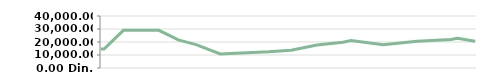
| Category | KVARTAL4 |
|---|---|
| 2013-04-23 | 14600 |
| 2013-04-25 | 14600 |
| 2013-05-07 | 29000 |
| 2013-05-14 | 29000 |
| 2013-05-14 | 29000 |
| 2013-05-29 | 29000 |
| 2013-06-10 | 21600 |
| 2013-06-21 | 17950 |
| 2013-07-06 | 10776.471 |
| 2013-08-05 | 12455.862 |
| 2013-08-19 | 13667.568 |
| 2013-09-04 | 17651.667 |
| 2013-09-20 | 19877.912 |
| 2013-09-25 | 21138.05 |
| 2013-10-15 | 17951.744 |
| 2013-11-05 | 20556.13 |
| 2013-11-26 | 21997.139 |
| 2013-11-30 | 22917.635 |
| 2013-12-11 | 20504.315 |